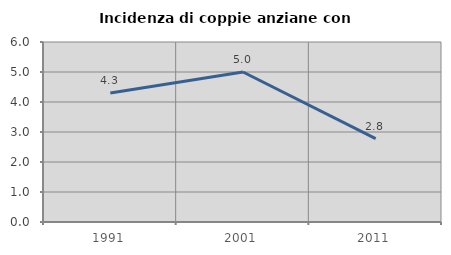
| Category | Incidenza di coppie anziane con figli |
|---|---|
| 1991.0 | 4.301 |
| 2001.0 | 5 |
| 2011.0 | 2.778 |